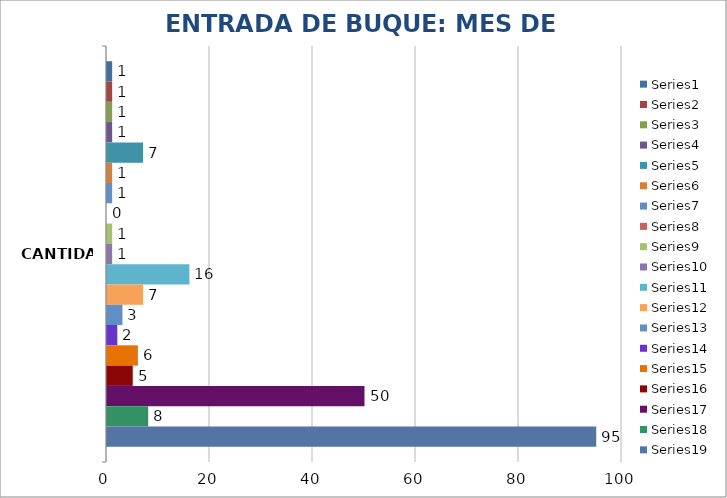
| Category | Series 0 | Series 1 | Series 2 | Series 3 | Series 4 | Series 5 | Series 6 | Series 7 | Series 8 | Series 9 | Series 10 | Series 11 | Series 12 | Series 13 | Series 14 | Series 15 | Series 16 | Series 17 | Series 18 |
|---|---|---|---|---|---|---|---|---|---|---|---|---|---|---|---|---|---|---|---|
| CANTIDAD | 1 | 1 | 1 | 1 | 7 | 1 | 1 | 0 | 1 | 1 | 16 | 7 | 3 | 2 | 6 | 5 | 50 | 8 | 95 |